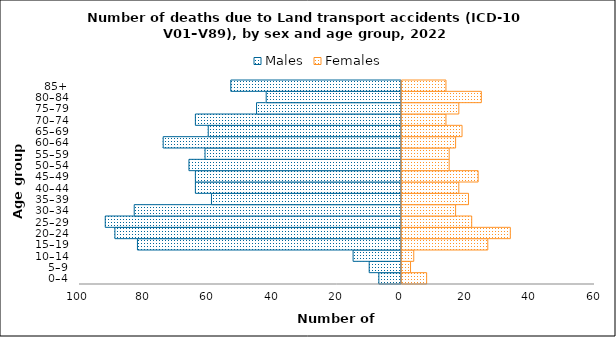
| Category | Males | Females |
|---|---|---|
| 0–4 | -7 | 8 |
| 5–9 | -10 | 3 |
| 10–14 | -15 | 4 |
| 15–19 | -82 | 27 |
| 20–24 | -89 | 34 |
| 25–29 | -92 | 22 |
| 30–34 | -83 | 17 |
| 35–39 | -59 | 21 |
| 40–44 | -64 | 18 |
| 45–49 | -64 | 24 |
| 50–54 | -66 | 15 |
| 55–59 | -61 | 15 |
| 60–64 | -74 | 17 |
| 65–69 | -60 | 19 |
| 70–74 | -64 | 14 |
| 75–79 | -45 | 18 |
| 80–84 | -42 | 25 |
| 85+ | -53 | 14 |